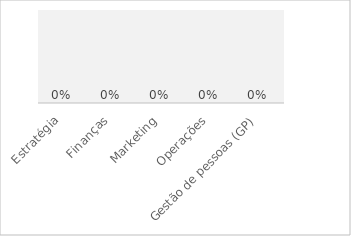
| Category | Pontuação Atual |
|---|---|
| Estratégia | 0 |
| Finanças | 0 |
| Marketing | 0 |
| Operações | 0 |
| Gestão de pessoas (GP) | 0 |